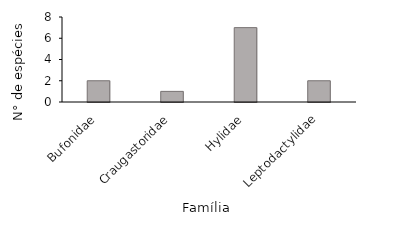
| Category | Series 0 |
|---|---|
| Bufonidae | 2 |
| Craugastoridae | 1 |
| Hylidae | 7 |
| Leptodactylidae | 2 |